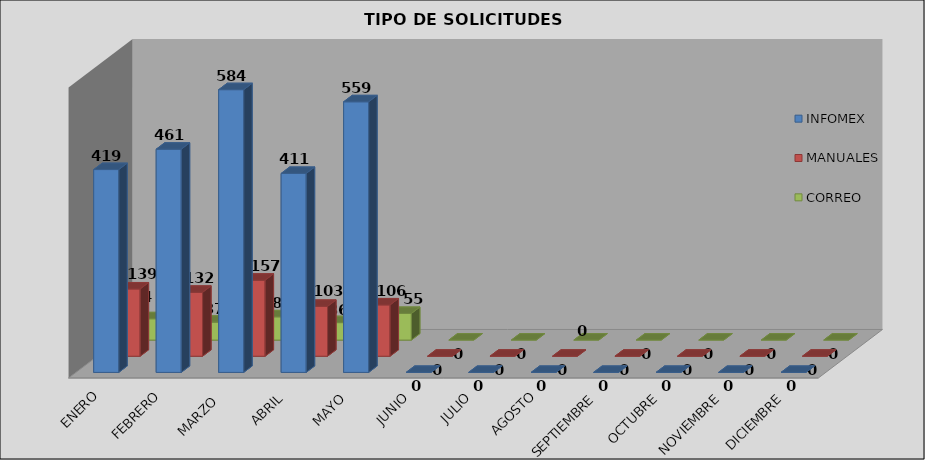
| Category | INFOMEX | MANUALES | CORREO |
|---|---|---|---|
| ENERO | 419 | 139 | 44 |
| FEBRERO | 461 | 132 | 37 |
| MARZO  | 584 | 157 | 48 |
| ABRIL | 411 | 103 | 36 |
| MAYO | 559 | 106 | 55 |
| JUNIO | 0 | 0 | 0 |
| JULIO | 0 | 0 | 0 |
| AGOSTO | 0 | 0 | 0 |
| SEPTIEMBRE | 0 | 0 | 0 |
| OCTUBRE | 0 | 0 | 0 |
| NOVIEMBRE | 0 | 0 | 0 |
| DICIEMBRE | 0 | 0 | 0 |